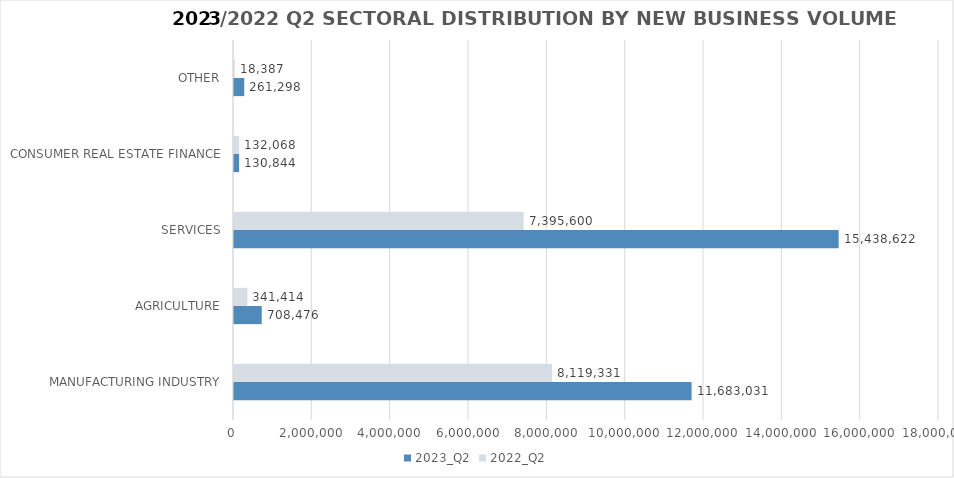
| Category | 2023_Q2 | 2022_Q2 |
|---|---|---|
| MANUFACTURING INDUSTRY | 11683030.577 | 8119330.631 |
| AGRICULTURE | 708476.389 | 341413.852 |
| SERVICES | 15438621.603 | 7395600.315 |
| CONSUMER REAL ESTATE FINANCE | 130844 | 132068 |
| OTHER | 261298 | 18387 |